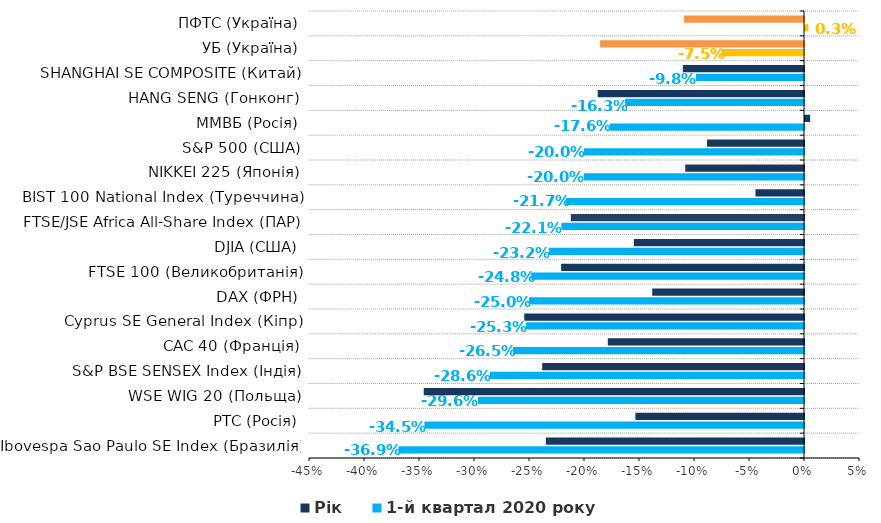
| Category | 1-й квартал 2020 року | Рік |
|---|---|---|
| Ibovespa Sao Paulo SE Index (Бразилія) | -0.369 | -0.235 |
| РТС (Росія) | -0.345 | -0.153 |
| WSE WIG 20 (Польща) | -0.296 | -0.346 |
| S&P BSE SENSEX Index (Індія) | -0.286 | -0.238 |
| CAC 40 (Франція) | -0.265 | -0.178 |
| Cyprus SE General Index (Кіпр) | -0.253 | -0.254 |
| DAX (ФРН) | -0.25 | -0.138 |
| FTSE 100 (Великобританія) | -0.248 | -0.221 |
| DJIA (США) | -0.232 | -0.155 |
| FTSE/JSE Africa All-Share Index (ПАР) | -0.221 | -0.212 |
| BIST 100 National Index (Туреччина) | -0.217 | -0.044 |
| NIKKEI 225 (Японія) | -0.2 | -0.108 |
| S&P 500 (США) | -0.2 | -0.088 |
| ММВБ (Росія) | -0.176 | 0.005 |
| HANG SENG (Гонконг) | -0.163 | -0.188 |
| SHANGHAI SE COMPOSITE (Китай) | -0.098 | -0.11 |
| УБ (Україна) | -0.075 | -0.185 |
| ПФТС (Україна) | 0.003 | -0.109 |